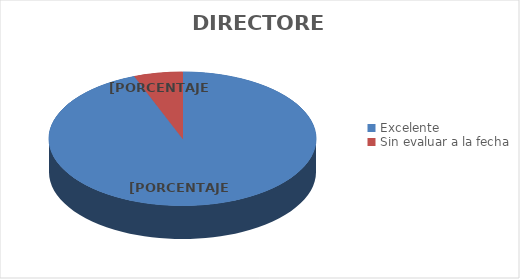
| Category | Cantidad |
|---|---|
| Excelente  | 16 |
| Sin evaluar a la fecha | 1 |